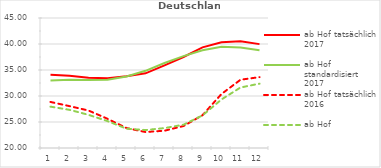
| Category | ab Hof tatsächlich 2017 | ab Hof standardisiert 2017 | ab Hof tatsächlich 2016 | ab Hof standardisiert 2016 |
|---|---|---|---|---|
| 0 | 34.079 | 32.971 | 28.855 | 27.951 |
| 1 | 33.913 | 33.12 | 28.054 | 27.341 |
| 2 | 33.489 | 33.089 | 27.208 | 26.377 |
| 3 | 33.435 | 33.123 | 25.62 | 25.173 |
| 4 | 33.804 | 33.767 | 23.838 | 23.719 |
| 5 | 34.365 | 34.841 | 23.071 | 23.452 |
| 6 | 35.896 | 36.349 | 23.325 | 23.828 |
| 7 | 37.501 | 37.66 | 24.227 | 24.479 |
| 8 | 39.349 | 38.804 | 26.307 | 26.264 |
| 9 | 40.344 | 39.452 | 30.384 | 29.334 |
| 10 | 40.521 | 39.312 | 33.129 | 31.637 |
| 11 | 39.976 | 38.817 | 33.629 | 32.372 |